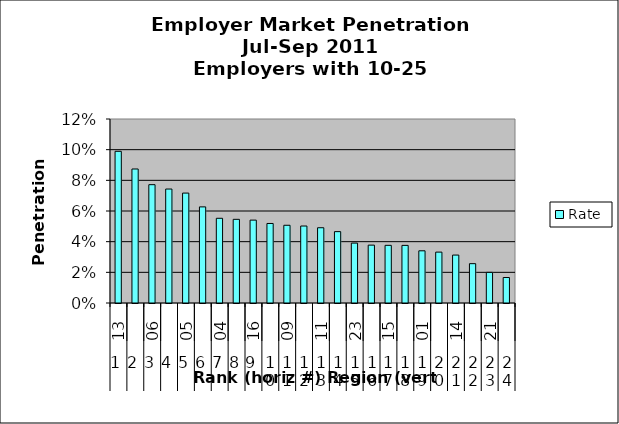
| Category | Rate |
|---|---|
| 0 | 0.099 |
| 1 | 0.087 |
| 2 | 0.077 |
| 3 | 0.074 |
| 4 | 0.072 |
| 5 | 0.063 |
| 6 | 0.055 |
| 7 | 0.055 |
| 8 | 0.054 |
| 9 | 0.052 |
| 10 | 0.051 |
| 11 | 0.05 |
| 12 | 0.049 |
| 13 | 0.047 |
| 14 | 0.039 |
| 15 | 0.038 |
| 16 | 0.038 |
| 17 | 0.038 |
| 18 | 0.034 |
| 19 | 0.033 |
| 20 | 0.031 |
| 21 | 0.026 |
| 22 | 0.02 |
| 23 | 0.017 |